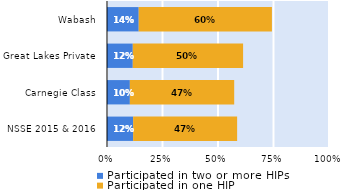
| Category | Participated in two or more HIPs | Participated in one HIP |
|---|---|---|
| NSSE 2015 & 2016 | 0.118 | 0.468 |
| Carnegie Class | 0.103 | 0.47 |
| Great Lakes Private | 0.116 | 0.497 |
| Wabash | 0.143 | 0.6 |